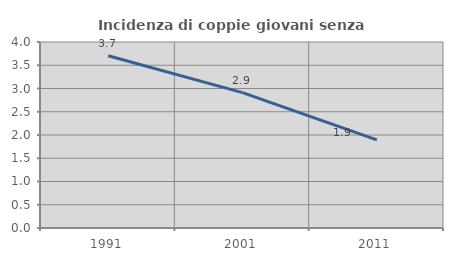
| Category | Incidenza di coppie giovani senza figli |
|---|---|
| 1991.0 | 3.704 |
| 2001.0 | 2.911 |
| 2011.0 | 1.895 |